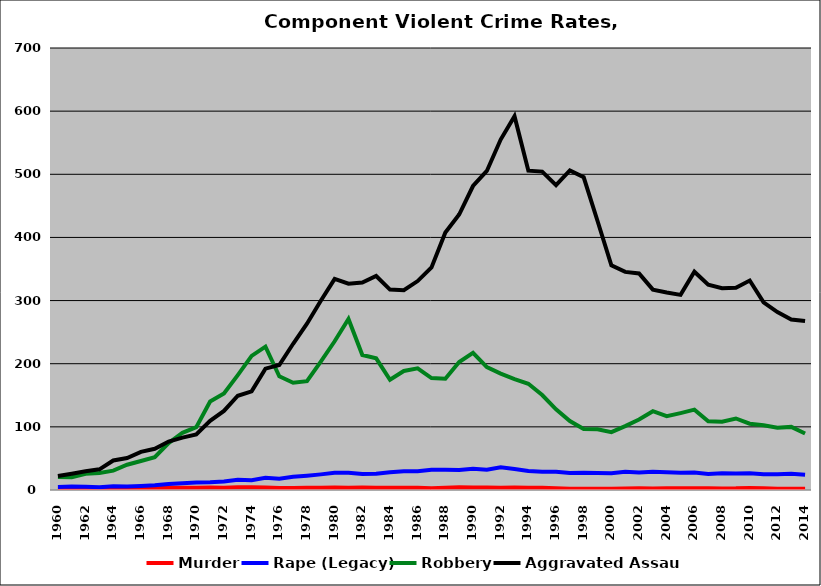
| Category | Murder | Rape (Legacy) | Robbery | Aggravated Assault |
|---|---|---|---|---|
| 1960.0 | 1.437 | 4.836 | 20.433 | 22.084 |
| 1961.0 | 1.471 | 5.56 | 20.367 | 25.659 |
| 1962.0 | 1.841 | 4.96 | 25.79 | 29.549 |
| 1963.0 | 1.936 | 4.523 | 27.003 | 32.733 |
| 1964.0 | 1.967 | 5.995 | 30.648 | 46.797 |
| 1965.0 | 2.412 | 5.423 | 39.996 | 50.711 |
| 1966.0 | 2.378 | 6.39 | 45.96 | 60.468 |
| 1967.0 | 2.841 | 7.582 | 51.983 | 65.228 |
| 1968.0 | 3.458 | 9.527 | 74.287 | 76.715 |
| 1969.0 | 3.494 | 10.829 | 90.635 | 82.934 |
| 1970.0 | 3.463 | 12.023 | 99.452 | 87.939 |
| 1971.0 | 3.821 | 12.418 | 140.135 | 109.639 |
| 1972.0 | 3.715 | 13.548 | 152.756 | 125.229 |
| 1973.0 | 4.4 | 16.311 | 181.953 | 149.261 |
| 1974.0 | 4.414 | 15.638 | 212.362 | 156.293 |
| 1975.0 | 4.152 | 19.235 | 226.99 | 192.193 |
| 1976.0 | 3.34 | 17.697 | 180.169 | 198.003 |
| 1977.0 | 3.079 | 20.806 | 169.872 | 231.581 |
| 1978.0 | 3.741 | 22.636 | 172.272 | 263.301 |
| 1979.0 | 3.675 | 24.753 | 203.224 | 299.636 |
| 1980.0 | 4.05 | 27.268 | 235.533 | 334.445 |
| 1981.0 | 3.64 | 27.383 | 270.936 | 326.69 |
| 1982.0 | 3.788 | 25.324 | 213.787 | 328.473 |
| 1983.0 | 3.52 | 25.923 | 208.479 | 338.876 |
| 1984.0 | 3.639 | 28.061 | 174.577 | 317.385 |
| 1985.0 | 3.47 | 29.784 | 188.492 | 316.455 |
| 1986.0 | 3.567 | 29.681 | 192.713 | 330.898 |
| 1987.0 | 2.955 | 31.904 | 177.267 | 352.519 |
| 1988.0 | 3.543 | 31.954 | 176.324 | 407.767 |
| 1989.0 | 4.296 | 31.811 | 202.604 | 436.276 |
| 1990.0 | 4.039 | 33.741 | 217.106 | 481.432 |
| 1991.0 | 4.153 | 32.121 | 194.613 | 505.237 |
| 1992.0 | 3.568 | 36.112 | 184.378 | 554.985 |
| 1993.0 | 3.876 | 33.367 | 175.699 | 591.999 |
| 1994.0 | 3.542 | 30.21 | 168.184 | 505.711 |
| 1995.0 | 3.573 | 28.959 | 150.428 | 504.215 |
| 1996.0 | 2.577 | 29.005 | 127.676 | 482.928 |
| 1997.0 | 1.945 | 26.921 | 109.121 | 506.195 |
| 1998.0 | 2.017 | 27.444 | 96.6 | 495.25 |
| 1999.0 | 1.976 | 26.93 | 96.046 | 426.013 |
| 2000.0 | 1.969 | 26.712 | 91.588 | 355.862 |
| 2001.0 | 2.234 | 28.995 | 101.169 | 345.406 |
| 2002.0 | 2.694 | 27.671 | 111.635 | 342.863 |
| 2003.0 | 2.181 | 28.783 | 124.775 | 317.397 |
| 2004.0 | 2.669 | 27.999 | 116.803 | 312.764 |
| 2005.0 | 2.767 | 27.217 | 121.818 | 308.983 |
| 2006.0 | 2.921 | 27.605 | 127.276 | 345.694 |
| 2007.0 | 2.915 | 25.52 | 108.903 | 325.036 |
| 2008.0 | 2.552 | 26.652 | 108.06 | 319.488 |
| 2009.0 | 2.624 | 26.298 | 113.246 | 320.448 |
| 2010.0 | 3.207 | 26.651 | 104.985 | 331.784 |
| 2011.0 | 2.785 | 25.034 | 102.437 | 297.048 |
| 2012.0 | 1.821 | 24.83 | 98.641 | 281.718 |
| 2013.0 | 2.057 | 25.667 | 99.942 | 270.06 |
| 2014.0 | 1.957 | 24.15 | 89.483 | 267.604 |